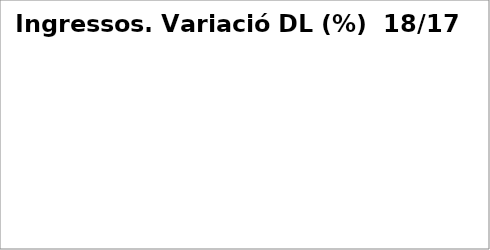
| Category | Series 0 |
|---|---|
| Impostos directes | -0.248 |
| Impostos indirectes | 0.034 |
| Taxes, preus públics i altres ingressos | -0.109 |
| Transferències corrents | -0.001 |
| Ingressos patrimonials | -0.285 |
| Venda d'inversions reals | -0.766 |
| Transferències de capital | 0.65 |
| Actius financers* | 0 |
| Passius financers | 0.285 |